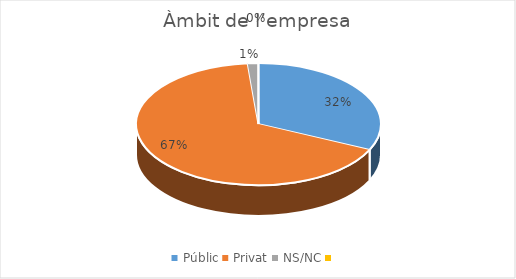
| Category | Series 0 |
|---|---|
| Públic | 23 |
| Privat | 48 |
| NS/NC | 1 |